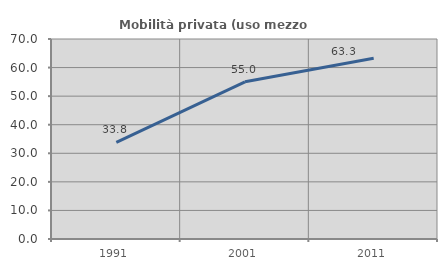
| Category | Mobilità privata (uso mezzo privato) |
|---|---|
| 1991.0 | 33.828 |
| 2001.0 | 55.008 |
| 2011.0 | 63.25 |